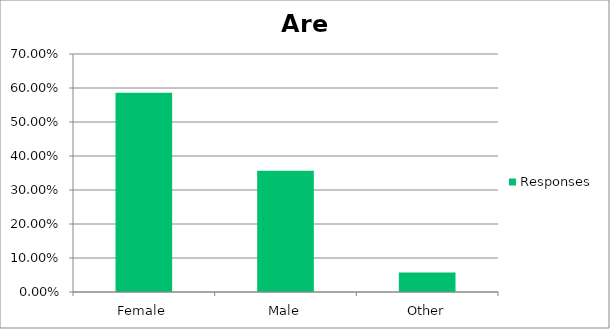
| Category | Responses |
|---|---|
| Female | 0.586 |
| Male | 0.356 |
| Other | 0.058 |